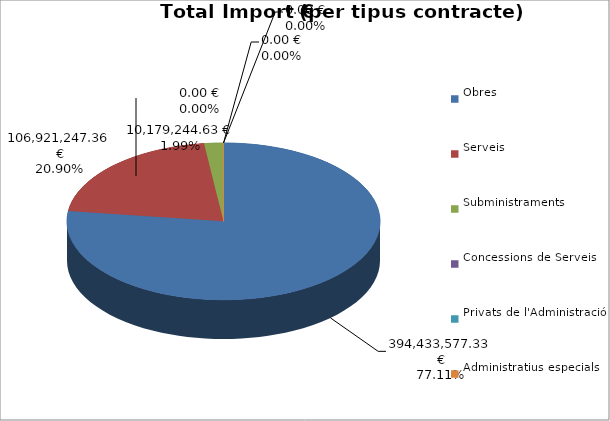
| Category | Total preu
(amb IVA) |
|---|---|
| Obres | 394433577.327 |
| Serveis | 106921247.363 |
| Subministraments | 10179244.633 |
| Concessions de Serveis | 0 |
| Privats de l'Administració | 0 |
| Administratius especials | 0 |